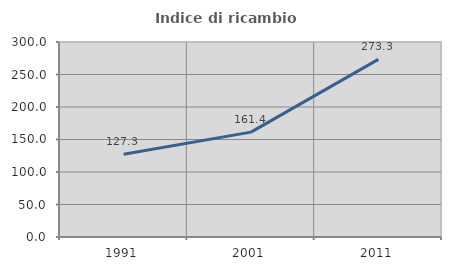
| Category | Indice di ricambio occupazionale  |
|---|---|
| 1991.0 | 127.336 |
| 2001.0 | 161.353 |
| 2011.0 | 273.333 |